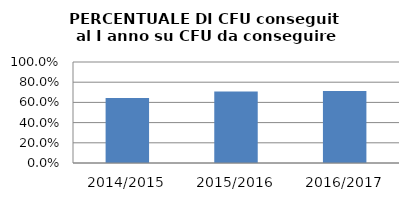
| Category | 2014/2015 2015/2016 2016/2017 |
|---|---|
| 2014/2015 | 0.644 |
| 2015/2016 | 0.707 |
| 2016/2017 | 0.713 |